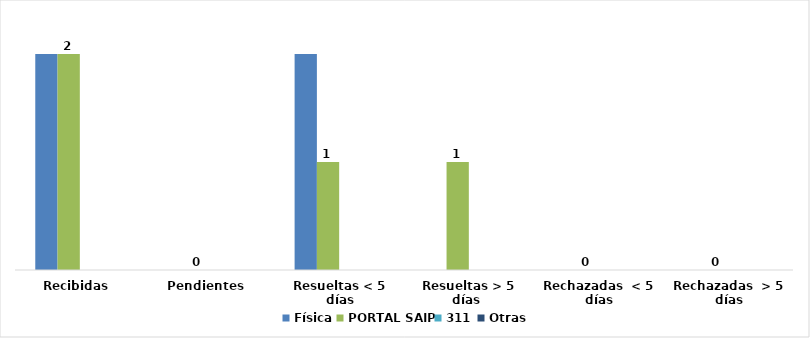
| Category | Física | PORTAL SAIP | 311 | Otras |
|---|---|---|---|---|
| Recibidas  | 2 | 2 | 0 | 0 |
| Pendientes  | 0 | 0 | 0 | 0 |
| Resueltas < 5 días | 2 | 1 | 0 | 0 |
| Resueltas > 5 días  | 0 | 1 | 0 | 0 |
| Rechazadas  < 5 días | 0 | 0 | 0 | 0 |
| Rechazadas  > 5 días | 0 | 0 | 0 | 0 |